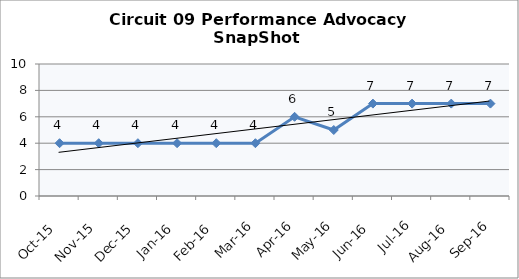
| Category | Circuit 09 |
|---|---|
| Oct-15 | 4 |
| Nov-15 | 4 |
| Dec-15 | 4 |
| Jan-16 | 4 |
| Feb-16 | 4 |
| Mar-16 | 4 |
| Apr-16 | 6 |
| May-16 | 5 |
| Jun-16 | 7 |
| Jul-16 | 7 |
| Aug-16 | 7 |
| Sep-16 | 7 |